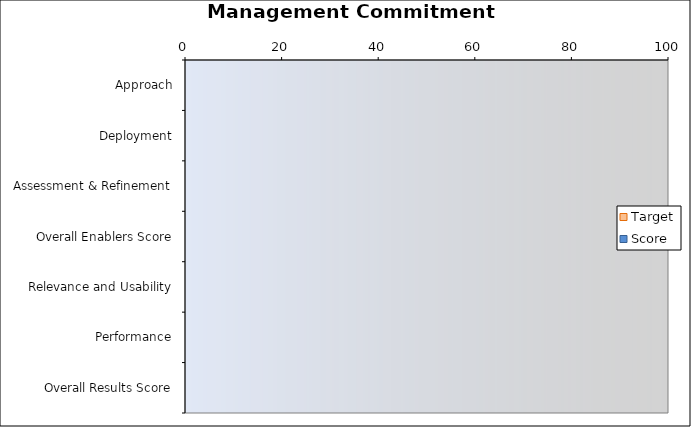
| Category | Target | Score |
|---|---|---|
| Approach | 0 | 0 |
| Deployment | 0 | 0 |
| Assessment & Refinement | 0 | 0 |
| Overall Enablers Score | 0 | 0 |
| Relevance and Usability | 0 | 0 |
| Performance | 0 | 0 |
| Overall Results Score | 0 | 0 |